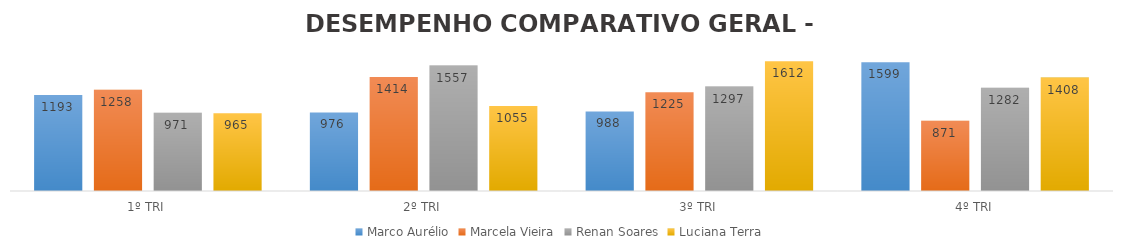
| Category | Marco Aurélio | Marcela Vieira | Renan Soares | Luciana Terra |
|---|---|---|---|---|
| 1º TRI | 1193 | 1258 | 971 | 965 |
| 2º TRI | 976 | 1414 | 1557 | 1055 |
| 3º TRI | 988 | 1225 | 1297 | 1612 |
| 4º TRI | 1599 | 871 | 1282 | 1408 |